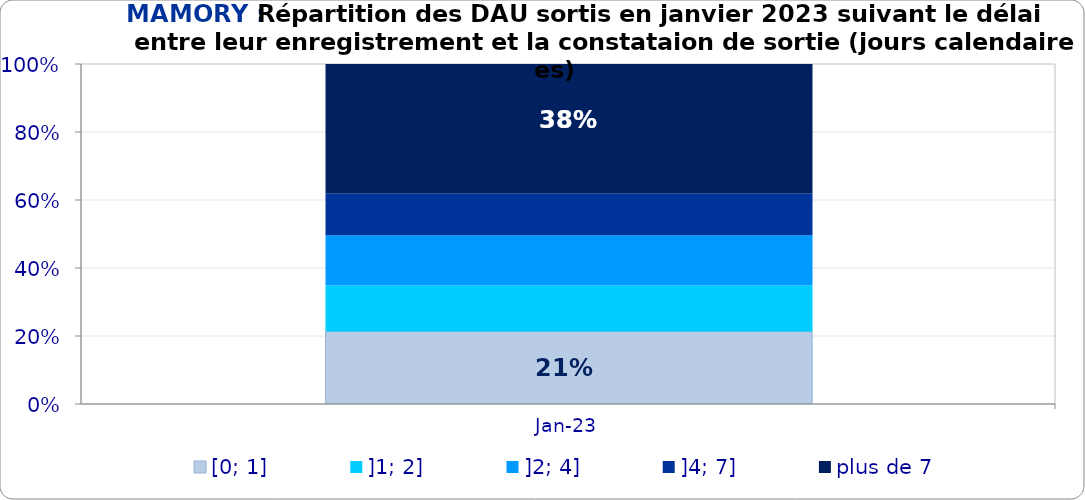
| Category | [0; 1] | ]1; 2] | ]2; 4] | ]4; 7] | plus de 7 |
|---|---|---|---|---|---|
| 2023-01-01 | 0.213 | 0.136 | 0.148 | 0.123 | 0.38 |